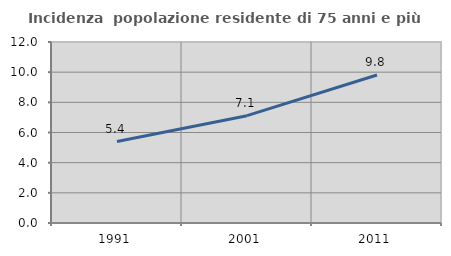
| Category | Incidenza  popolazione residente di 75 anni e più |
|---|---|
| 1991.0 | 5.403 |
| 2001.0 | 7.115 |
| 2011.0 | 9.808 |